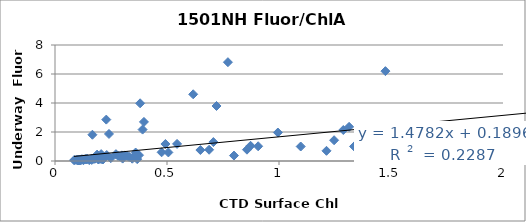
| Category | Series 0 |
|---|---|
| 0.367 | 0.128 |
| 0.345 | 0.159 |
| 0.331 | 0.284 |
| 0.106 | 0.041 |
| 0.097 | 0.078 |
| 0.116 | 0.093 |
| 0.085 | 0.056 |
| 0.114 | 0.037 |
| 0.089 | 0.07 |
| 0.107 | 0.093 |
| 0.132 | 0.101 |
| 0.1 | 0.073 |
| 0.108 | 0.084 |
| 0.114 | 0.079 |
| 0.121 | 0.102 |
| 0.288 | 0.326 |
| 0.178 | 0.155 |
| 0.214 | 0.103 |
| 0.206 | 0.14 |
| 0.649 | 0.757 |
| 0.873 | 1.048 |
| 0.857 | 0.781 |
| 2.21 | 1.376 |
| 0.213 | 0.181 |
| 0.206 | 0.161 |
| 0.164 | 0.074 |
| 0.173 | 0.148 |
| 0.476 | 0.601 |
| 0.119 | 0.115 |
| 0.14 | 0.114 |
| 0.127 | 0.053 |
| 0.106 | 0.041 |
| 0.121 | 0.114 |
| 0.11 | 0.084 |
| 0.101 | 0.066 |
| 0.153 | 0.063 |
| 0.109 | 0.089 |
| 0.137 | 0.139 |
| 0.194 | 0.105 |
| 0.302 | 0.166 |
| 0.176 | 0.184 |
| 0.13 | 0.117 |
| 0.799 | 0.374 |
| 1.097 | 1 |
| 1.212 | 0.702 |
| 1.474 | 0.445 |
| 0.707 | 1.304 |
| 0.311 | 0.386 |
| 0.907 | 1.016 |
| 0.359 | 0.405 |
| 0.322 | 0.347 |
| 0.194 | 0.112 |
| 0.142 | 0.14 |
| 0.106 | 0.083 |
| 0.144 | 0.138 |
| 0.18 | 0.19 |
| 0.163 | 0.164 |
| 0.249 | 0.195 |
| 0.298 | 0.387 |
| 0.281 | 0.358 |
| 0.506 | 0.592 |
| 0.688 | 0.775 |
| 1.335 | 1.005 |
| 0.375 | 0.403 |
| 0.36 | 0.583 |
| 0.231 | 0.412 |
| 0.272 | 0.472 |
| 0.219 | 0.313 |
| 0.188 | 0.44 |
| 0.206 | 0.475 |
| 0.545 | 1.178 |
| 1.246 | 1.433 |
| 0.493 | 1.173 |
| 0.995 | 1.964 |
| 1.287 | 2.137 |
| 1.313 | 2.355 |
| 0.241 | 1.865 |
| 0.167 | 1.811 |
| 0.391 | 2.167 |
| 0.397 | 2.696 |
| 0.229 | 2.855 |
| 0.721 | 3.794 |
| 0.38 | 3.979 |
| 0.617 | 4.601 |
| 1.475 | 6.197 |
| 0.772 | 6.815 |